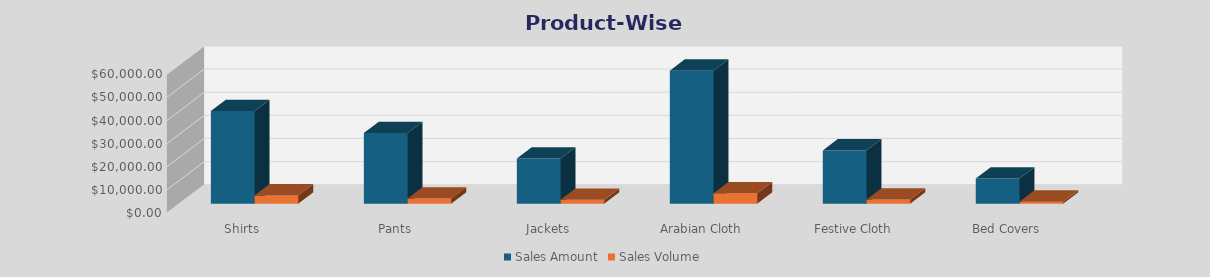
| Category | Sales Amount | Sales Volume |
|---|---|---|
| Shirts | 40047 | 3570 |
| Pants | 30577 | 2250 |
| Jackets | 19517.5 | 1650 |
| Arabian Cloth | 57519 | 4490 |
| Festive Cloth | 23020 | 1770 |
| Bed Covers | 10845.5 | 860 |